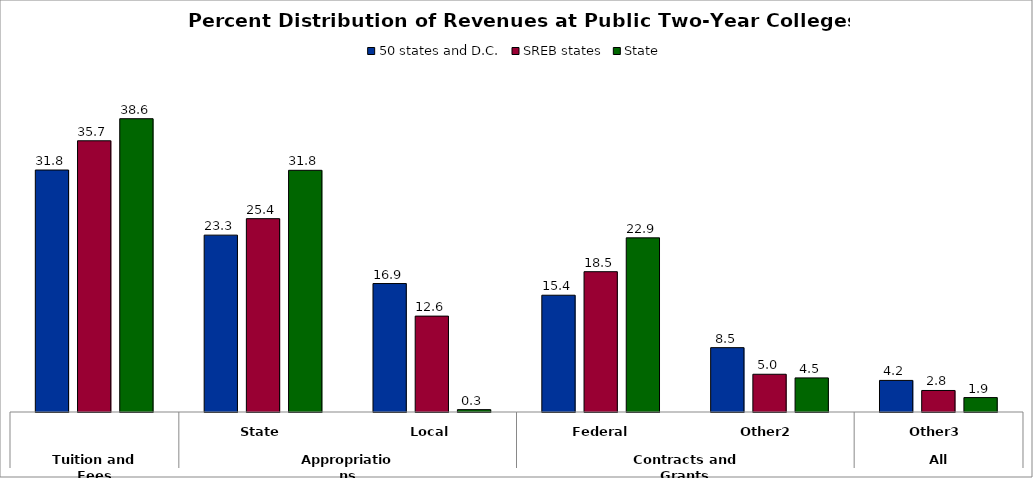
| Category | 50 states and D.C. | SREB states | State |
|---|---|---|---|
| 0 | 31.838 | 35.686 | 38.59 |
| 1 | 23.271 | 25.438 | 31.802 |
| 2 | 16.903 | 12.616 | 0.311 |
| 3 | 15.365 | 18.461 | 22.913 |
| 4 | 8.466 | 4.965 | 4.487 |
| 5 | 4.157 | 2.833 | 1.897 |